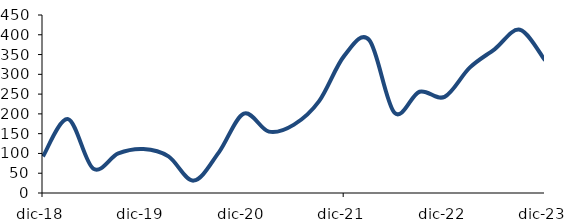
| Category | Series 0 |
|---|---|
| 2018-12-01 | 92.583 |
| 2019-03-01 | 186.657 |
| 2019-06-01 | 61.617 |
| 2019-09-01 | 100.072 |
| 2019-12-01 | 111.063 |
| 2020-03-01 | 92.652 |
| 2020-06-01 | 31.315 |
| 2020-09-01 | 102.109 |
| 2020-12-01 | 200.686 |
| 2021-03-01 | 155.05 |
| 2021-06-01 | 172.885 |
| 2021-09-01 | 232.291 |
| 2021-12-01 | 346.663 |
| 2022-03-01 | 386.449 |
| 2022-06-01 | 203.151 |
| 2022-09-01 | 255.965 |
| 2022-12-01 | 242.93 |
| 2023-03-01 | 316.829 |
| 2023-06-01 | 363.9 |
| 2023-09-01 | 412.686 |
| 2023-12-01 | 335.357 |